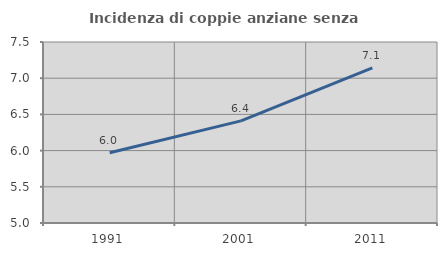
| Category | Incidenza di coppie anziane senza figli  |
|---|---|
| 1991.0 | 5.97 |
| 2001.0 | 6.41 |
| 2011.0 | 7.143 |